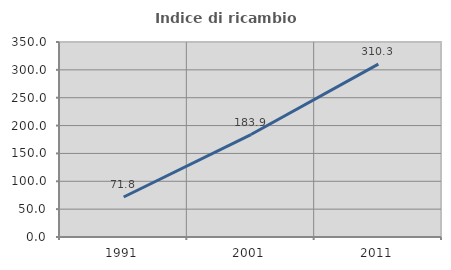
| Category | Indice di ricambio occupazionale  |
|---|---|
| 1991.0 | 71.831 |
| 2001.0 | 183.871 |
| 2011.0 | 310.345 |